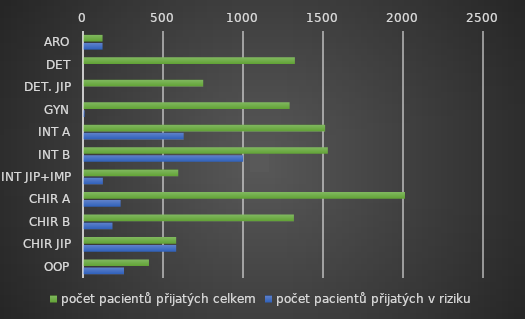
| Category | počet pacientů přijatých celkem | počet pacientů přijatých v riziku |
|---|---|---|
| ARO | 116 | 116 |
| DET | 1318 | 0 |
| DET. JIP | 745 | 0 |
| GYN | 1285 | 4 |
| INT A | 1507 | 623 |
| INT B | 1524 | 995 |
| INT JIP+IMP | 589 | 118 |
| CHIR A | 2006 | 229 |
| CHIR B | 1312 | 178 |
| CHIR JIP | 576 | 576 |
| OOP | 406 | 250 |